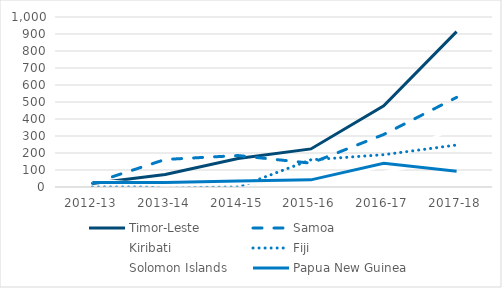
| Category | Timor-Leste | Samoa | Kiribati | Fiji | Solomon Islands | Papua New Guinea |
|---|---|---|---|---|---|---|
| 2012-13 | 21 | 22 | 34 | 0 | 42 | 26 |
| 2013-14 | 74 | 162 | 14 | 0 | 9 | 26 |
| 2014-15 | 168 | 185 | 11 | 0 | 21 | 35 |
| 2015-16 | 224 | 140 | 20 | 160 | 61 | 42 |
| 2016-17 | 477 | 309 | 124 | 190 | 87 | 139 |
| 2017-18 | 914 | 527 | 364 | 247 | 175 | 92 |